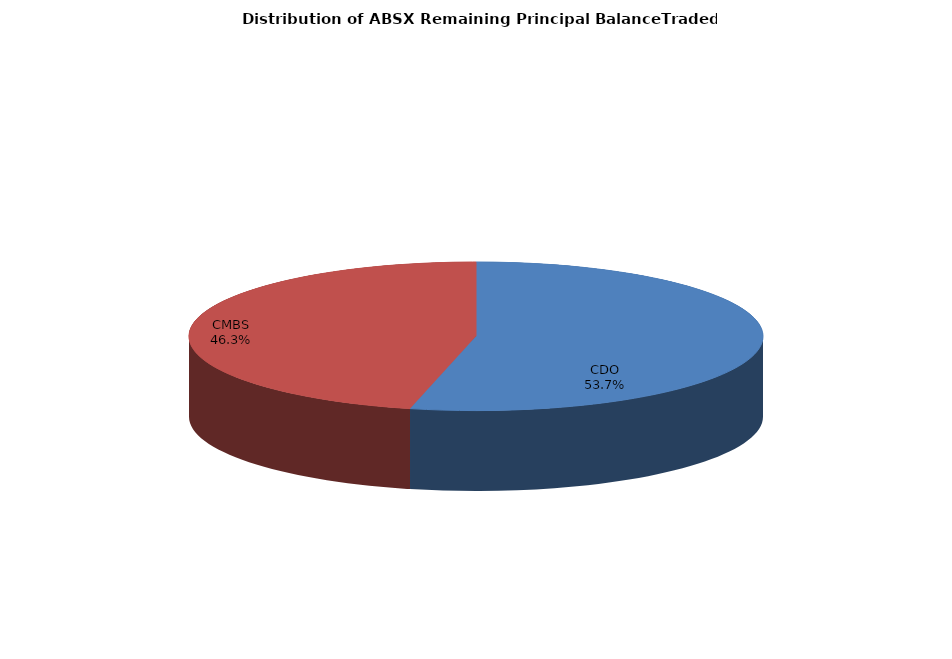
| Category | Series 0 |
|---|---|
| CDO | 1839267887.118 |
| CMBS | 1586728238.094 |